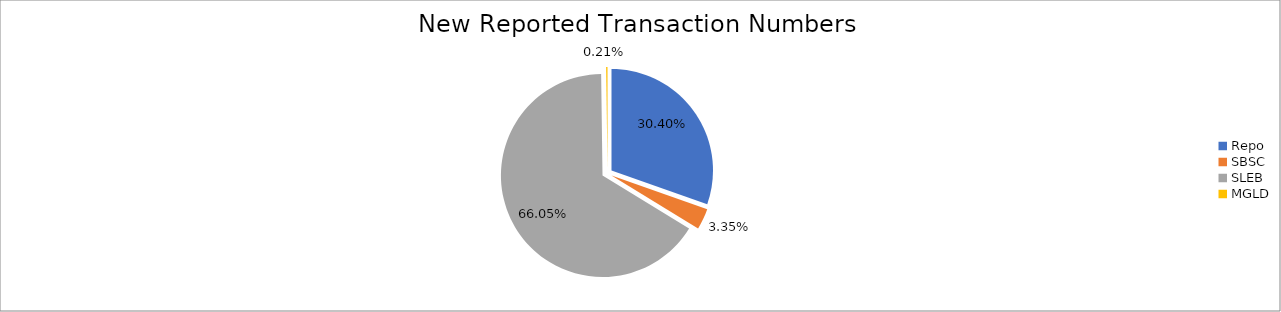
| Category | Series 0 |
|---|---|
| Repo | 380069 |
| SBSC | 41828 |
| SLEB | 825866 |
| MGLD | 2664 |